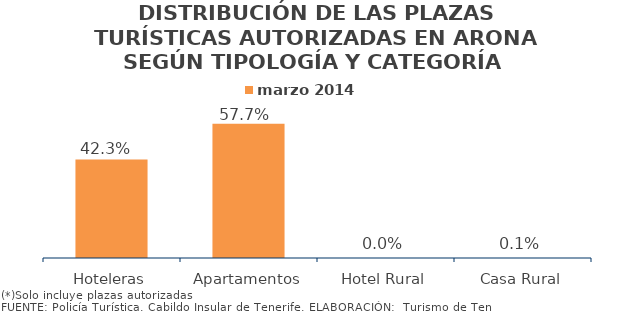
| Category | marzo 2014 |
|---|---|
| Hoteleras | 0.423 |
| Apartamentos | 0.577 |
| Hotel Rural | 0 |
| Casa Rural | 0.001 |